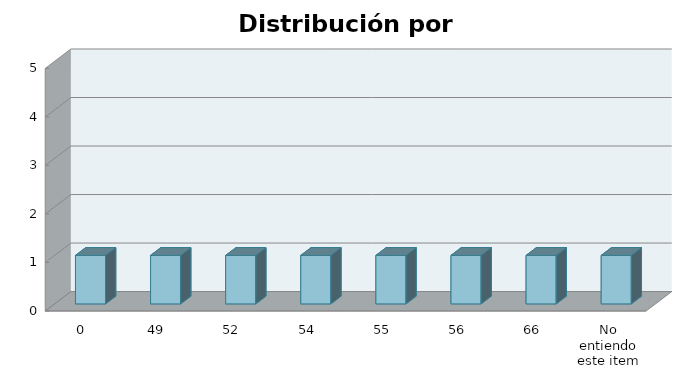
| Category | Series 1 |
|---|---|
| 0 | 1 |
| 49 | 1 |
| 52 | 1 |
| 54 | 1 |
| 55 | 1 |
| 56 | 1 |
| 66 | 1 |
| No entiendo este item | 1 |